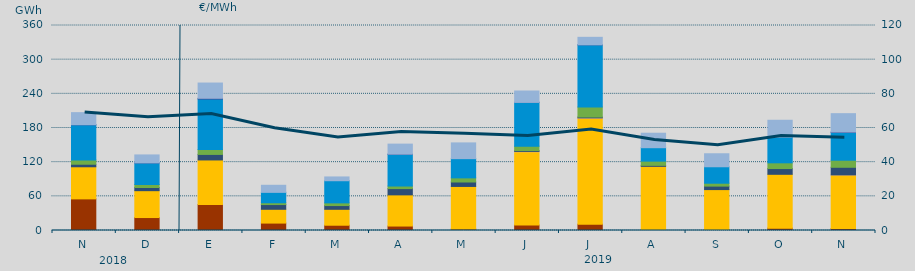
| Category | Carbón | Ciclo Combinado | Cogeneración | Consumo Bombeo | Eólica | Hidráulica | Nuclear | Otras Renovables | Turbinación bombeo |
|---|---|---|---|---|---|---|---|---|---|
| N | 55536.6 | 56365.7 | 0 | 4442.2 | 7624.8 | 61627.7 | 200 | 0 | 21168.7 |
| D | 22754.1 | 47185.3 | 0 | 5564.6 | 5249.4 | 37928.6 | 81 | 0 | 13945.1 |
| E | 45764.1 | 78136.9 | 0 | 9703.8 | 8718.7 | 88684.7 | 1159.3 | 0 | 26791.4 |
| F | 13008.4 | 24231.2 | 0 | 8329.6 | 3127.4 | 18281.1 | 0 | 0 | 12422.8 |
| M | 9261.4 | 27952 | 0 | 6580.9 | 4696.4 | 38895.4 | 0 | 0 | 6656.1 |
| A | 7813.1 | 54755.9 | 0 | 11010.9 | 4506.1 | 55784.8 | 149.4 | 0 | 17672.7 |
| M | 2747.5 | 74607.7 | 0 | 7818.6 | 7248.2 | 33753.6 | 0 | 0 | 27655 |
| J | 9630 | 128693.8 | 467.1 | 1487.8 | 7835.7 | 76799.4 | 366 | 20 | 19680.5 |
| J | 11017.4 | 186524.2 | 300.4 | 1392.5 | 17639.5 | 109155.5 | 60 | 0 | 13153.1 |
| A | 1459.4 | 111215 | 0 | 1733.4 | 7402.2 | 23588.2 | 0 | 0 | 25429.5 |
| S | 311.6 | 71523.4 | 0 | 6112.7 | 5081.7 | 28895.9 | 0 | 0 | 22840.2 |
| O | 4163.7 | 94511.7 | 0 | 10093.2 | 10069.8 | 45049.8 | 0 | 0 | 29699 |
| N | 3677.8 | 93991.4 | 51.5 | 13298.4 | 12383 | 48971.8 | 539 | 0 | 32260 |